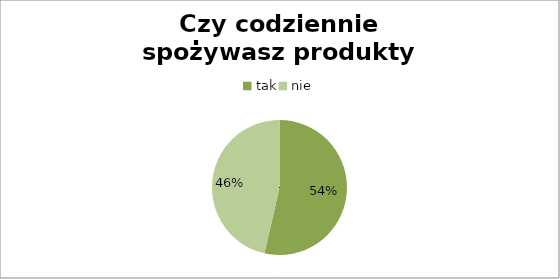
| Category | Czy codziennie spożywasz produkty mleczne? |
|---|---|
| tak | 15 |
| nie | 13 |